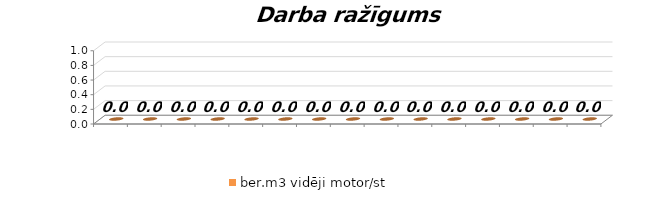
| Category | ber.m3 vidēji motor/st |
|---|---|
|  | 0 |
|  | 0 |
|  | 0 |
|  | 0 |
|  | 0 |
|  | 0 |
|  | 0 |
|  | 0 |
|  | 0 |
|  | 0 |
|  | 0 |
|  | 0 |
|  | 0 |
|  | 0 |
|  | 0 |